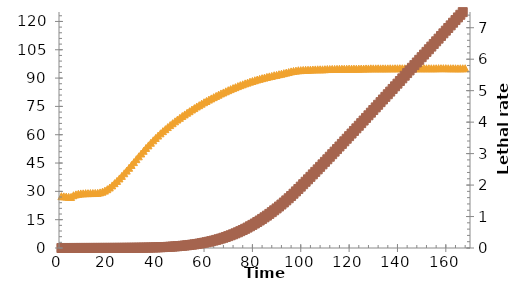
| Category | Series 0 |
|---|---|
| 1.0 | 27.45 |
| 2.0 | 27.35 |
| 3.0 | 27.25 |
| 4.0 | 27.1 |
| 5.0 | 27.05 |
| 6.0 | 27.95 |
| 7.0 | 28.4 |
| 8.0 | 28.7 |
| 9.0 | 28.9 |
| 10.0 | 28.95 |
| 11.0 | 29.05 |
| 12.0 | 29.05 |
| 13.0 | 29.1 |
| 14.0 | 29.1 |
| 15.0 | 29.15 |
| 16.0 | 29.2 |
| 17.0 | 29.45 |
| 18.0 | 29.85 |
| 19.0 | 30.4 |
| 20.0 | 31.15 |
| 21.0 | 32.05 |
| 22.0 | 33.15 |
| 23.0 | 34.35 |
| 24.0 | 35.55 |
| 25.0 | 36.85 |
| 26.0 | 38.2 |
| 27.0 | 39.6 |
| 28.0 | 41 |
| 29.0 | 42.5 |
| 30.0 | 44 |
| 31.0 | 45.5 |
| 32.0 | 47.05 |
| 33.0 | 48.55 |
| 34.0 | 50.05 |
| 35.0 | 51.5 |
| 36.0 | 53 |
| 37.0 | 54.35 |
| 38.0 | 55.75 |
| 39.0 | 57.05 |
| 40.0 | 58.3 |
| 41.0 | 59.55 |
| 42.0 | 60.75 |
| 43.0 | 61.9 |
| 44.0 | 62.95 |
| 45.0 | 64.05 |
| 46.0 | 65.1 |
| 47.0 | 66.1 |
| 48.0 | 67.1 |
| 49.0 | 68.05 |
| 50.0 | 68.95 |
| 51.0 | 69.9 |
| 52.0 | 70.75 |
| 53.0 | 71.65 |
| 54.0 | 72.45 |
| 55.0 | 73.35 |
| 56.0 | 74.1 |
| 57.0 | 74.95 |
| 58.0 | 75.65 |
| 59.0 | 76.45 |
| 60.0 | 77.2 |
| 61.0 | 77.85 |
| 62.0 | 78.6 |
| 63.0 | 79.25 |
| 64.0 | 79.9 |
| 65.0 | 80.55 |
| 66.0 | 81.2 |
| 67.0 | 81.85 |
| 68.0 | 82.4 |
| 69.0 | 83 |
| 70.0 | 83.6 |
| 71.0 | 84.15 |
| 72.0 | 84.7 |
| 73.0 | 85.2 |
| 74.0 | 85.75 |
| 75.0 | 86.25 |
| 76.0 | 86.7 |
| 77.0 | 87.2 |
| 78.0 | 87.6 |
| 79.0 | 88.1 |
| 80.0 | 88.45 |
| 81.0 | 88.85 |
| 82.0 | 89.25 |
| 83.0 | 89.6 |
| 84.0 | 89.95 |
| 85.0 | 90.25 |
| 86.0 | 90.6 |
| 87.0 | 90.9 |
| 88.0 | 91.15 |
| 89.0 | 91.5 |
| 90.0 | 91.7 |
| 91.0 | 92.05 |
| 92.0 | 92.3 |
| 93.0 | 92.6 |
| 94.0 | 92.9 |
| 95.0 | 93.2 |
| 96.0 | 93.55 |
| 97.0 | 93.8 |
| 98.0 | 93.95 |
| 99.0 | 94.15 |
| 100.0 | 94.2 |
| 101.0 | 94.3 |
| 102.0 | 94.4 |
| 103.0 | 94.4 |
| 104.0 | 94.5 |
| 105.0 | 94.55 |
| 106.0 | 94.6 |
| 107.0 | 94.65 |
| 108.0 | 94.65 |
| 109.0 | 94.65 |
| 110.0 | 94.7 |
| 111.0 | 94.8 |
| 112.0 | 94.8 |
| 113.0 | 94.85 |
| 114.0 | 94.85 |
| 115.0 | 94.9 |
| 116.0 | 94.95 |
| 117.0 | 94.95 |
| 118.0 | 94.95 |
| 119.0 | 94.95 |
| 120.0 | 95 |
| 121.0 | 95 |
| 122.0 | 95 |
| 123.0 | 95 |
| 124.0 | 95 |
| 125.0 | 95.05 |
| 126.0 | 95.05 |
| 127.0 | 95.1 |
| 128.0 | 95.1 |
| 129.0 | 95.15 |
| 130.0 | 95.15 |
| 131.0 | 95.15 |
| 132.0 | 95.15 |
| 133.0 | 95.15 |
| 134.0 | 95.15 |
| 135.0 | 95.15 |
| 136.0 | 95.15 |
| 137.0 | 95.2 |
| 138.0 | 95.15 |
| 139.0 | 95.2 |
| 140.0 | 95.2 |
| 141.0 | 95.2 |
| 142.0 | 95.2 |
| 143.0 | 95.2 |
| 144.0 | 95.2 |
| 145.0 | 95.2 |
| 146.0 | 95.2 |
| 147.0 | 95.2 |
| 148.0 | 95.2 |
| 149.0 | 95.2 |
| 150.0 | 95.2 |
| 151.0 | 95.2 |
| 152.0 | 95.2 |
| 153.0 | 95.2 |
| 154.0 | 95.2 |
| 155.0 | 95.2 |
| 156.0 | 95.2 |
| 157.0 | 95.25 |
| 158.0 | 95.25 |
| 159.0 | 95.25 |
| 160.0 | 95.25 |
| 161.0 | 95.2 |
| 162.0 | 95.2 |
| 163.0 | 95.2 |
| 164.0 | 95.2 |
| 165.0 | 95.15 |
| 166.0 | 95.2 |
| 167.0 | 95.2 |
| 168.0 | 95.2 |